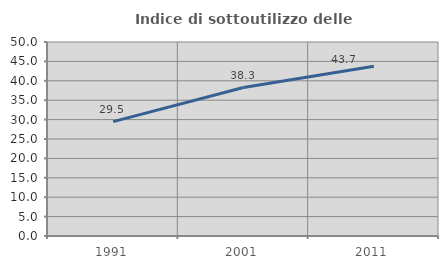
| Category | Indice di sottoutilizzo delle abitazioni  |
|---|---|
| 1991.0 | 29.487 |
| 2001.0 | 38.272 |
| 2011.0 | 43.733 |